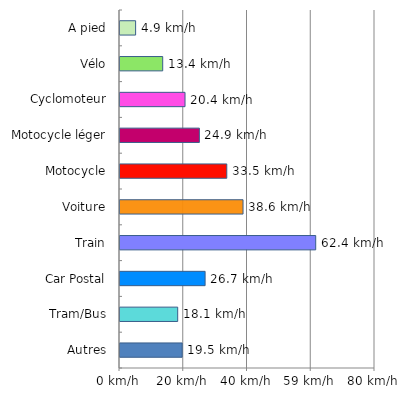
| Category | Series 0 |
|---|---|
| A pied | 4.9 |
| Vélo | 13.4 |
| Cyclomoteur | 20.4 |
| Motocycle léger | 24.9 |
| Motocycle | 33.5 |
| Voiture | 38.6 |
| Train | 61.4 |
| Car Postal | 26.7 |
| Tram/Bus | 18.1 |
| Autres | 19.5 |